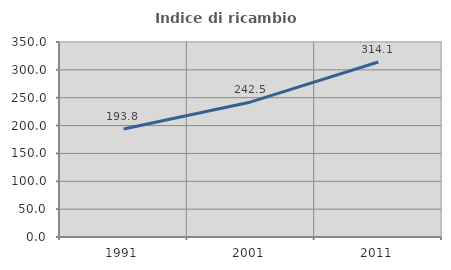
| Category | Indice di ricambio occupazionale  |
|---|---|
| 1991.0 | 193.805 |
| 2001.0 | 242.466 |
| 2011.0 | 314.098 |